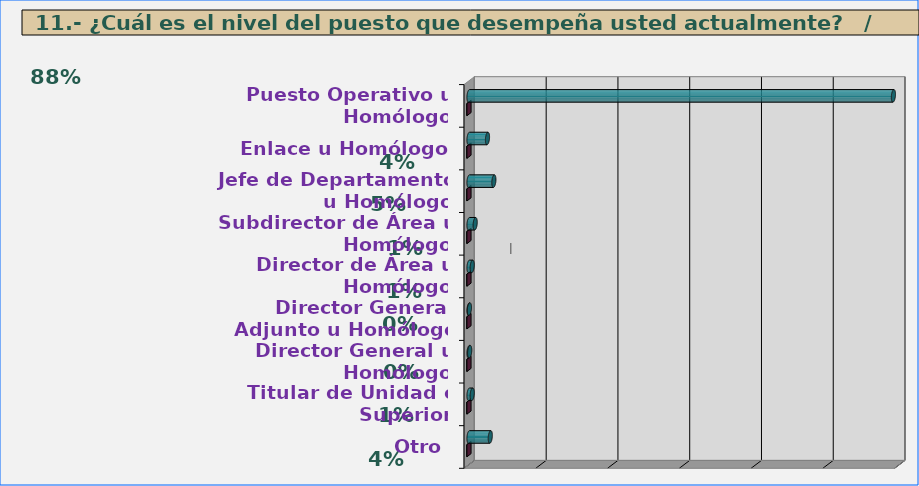
| Category | Series 0 | Series 1 |
|---|---|---|
| Puesto Operativo u Homólogo | 11828 | 0.882 |
| Enlace u Homólogo | 515 | 0.038 |
| Jefe de Departamento u Homólogo | 693 | 0.052 |
| Subdirector de Área u Homólogo | 172 | 0.013 |
| Director de Área u Homólogo | 89 | 0.007 |
| Director General Adjunto u Homólogo | 11 | 0.001 |
| Director General u Homólogo | 19 | 0.001 |
| Titular de Unidad o Superior | 89 | 0.007 |
| Otro | 593 | 0.04 |